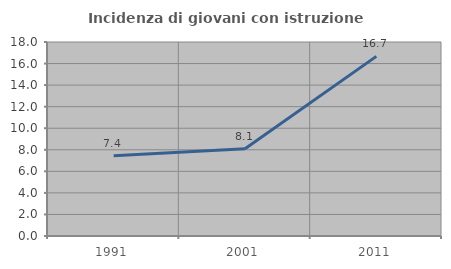
| Category | Incidenza di giovani con istruzione universitaria |
|---|---|
| 1991.0 | 7.443 |
| 2001.0 | 8.086 |
| 2011.0 | 16.667 |